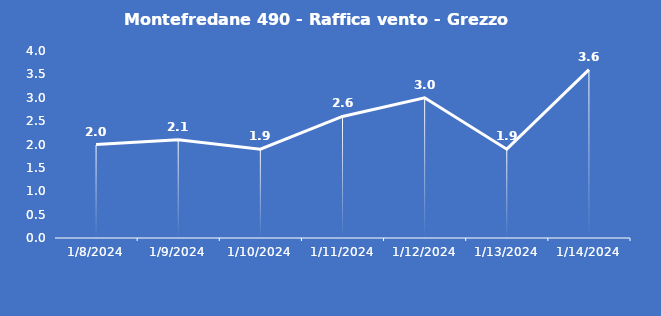
| Category | Montefredane 490 - Raffica vento - Grezzo (m/s) |
|---|---|
| 1/8/24 | 2 |
| 1/9/24 | 2.1 |
| 1/10/24 | 1.9 |
| 1/11/24 | 2.6 |
| 1/12/24 | 3 |
| 1/13/24 | 1.9 |
| 1/14/24 | 3.6 |